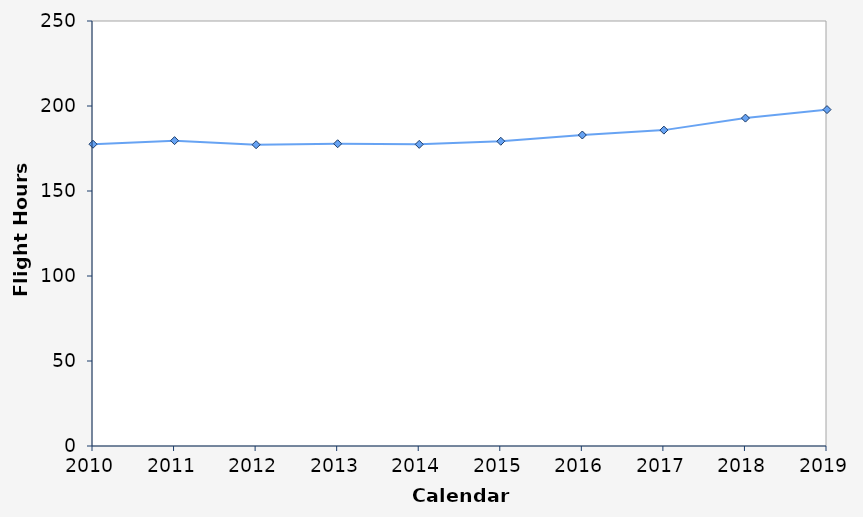
| Category | Flight Hours (100,000s) |
|---|---|
| 2010.0 | 177.51 |
| 2011.0 | 179.63 |
| 2012.0 | 177.222 |
| 2013.0 | 177.796 |
| 2014.0 | 177.428 |
| 2015.0 | 179.258 |
| 2016.0 | 182.941 |
| 2017.0 | 185.814 |
| 2018.0 | 192.885 |
| 2019.0 | 197.884 |